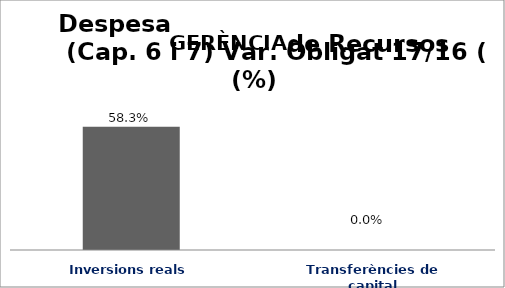
| Category | Series 0 |
|---|---|
| Inversions reals | 0.583 |
| Transferències de capital | 0 |